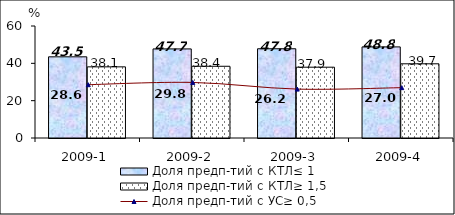
| Category | Доля предп-тий с КТЛ≤ 1 | Доля предп-тий с КТЛ≥ 1,5 |
|---|---|---|
| 2009-1 | 43.493 | 38.111 |
| 2009-2 | 47.722 | 38.426 |
| 2009-3 | 47.811 | 37.935 |
| 2009-4 | 48.803 | 39.749 |